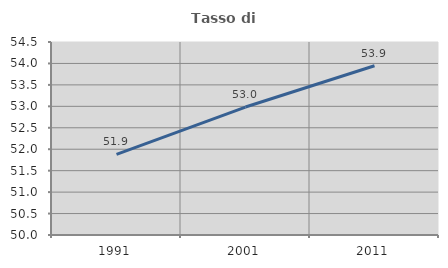
| Category | Tasso di occupazione   |
|---|---|
| 1991.0 | 51.878 |
| 2001.0 | 52.983 |
| 2011.0 | 53.947 |